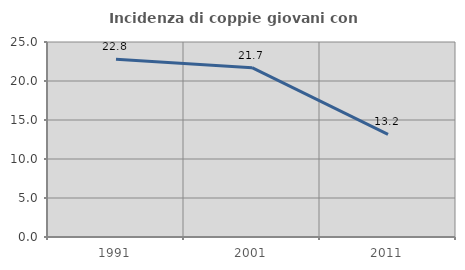
| Category | Incidenza di coppie giovani con figli |
|---|---|
| 1991.0 | 22.786 |
| 2001.0 | 21.711 |
| 2011.0 | 13.153 |